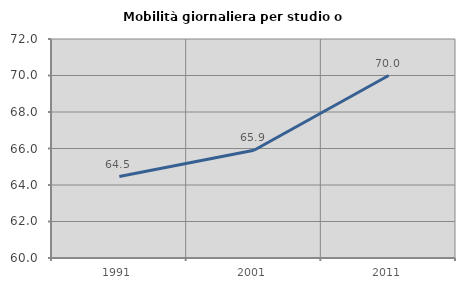
| Category | Mobilità giornaliera per studio o lavoro |
|---|---|
| 1991.0 | 64.465 |
| 2001.0 | 65.902 |
| 2011.0 | 69.998 |